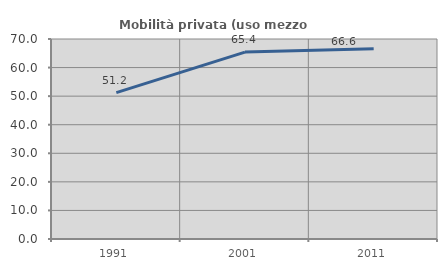
| Category | Mobilità privata (uso mezzo privato) |
|---|---|
| 1991.0 | 51.217 |
| 2001.0 | 65.422 |
| 2011.0 | 66.593 |